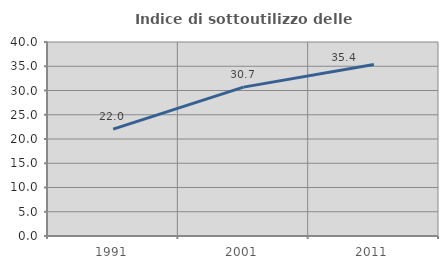
| Category | Indice di sottoutilizzo delle abitazioni  |
|---|---|
| 1991.0 | 22.04 |
| 2001.0 | 30.695 |
| 2011.0 | 35.356 |